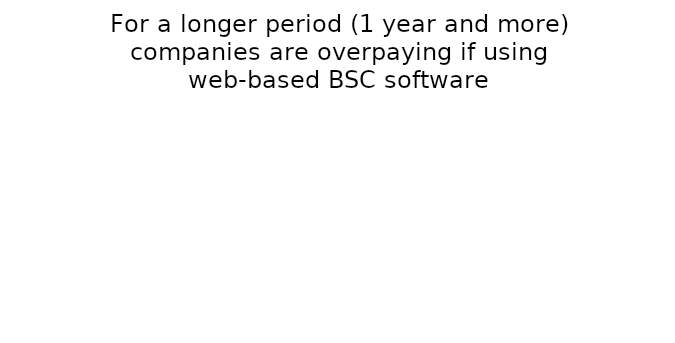
| Category | 1 Business Professional | 1 Business Unit | 5 Business Units (5 power + 5 input users) | 5 Business Units (5 power + 10 input users) |
|---|---|---|---|---|
| 1st Year | 332 | 692 | 3460 | 1660 |
| 2nd Year | 931.2 | 1291.2 | 6456 | 4656 |
| 3rd Year | 931.2 | 1291.2 | 6456 | 4656 |
| 4th Year | 931.2 | 1291.2 | 6456 | 4656 |
| 5th Year | 931.2 | 1291.2 | 6456 | 4656 |